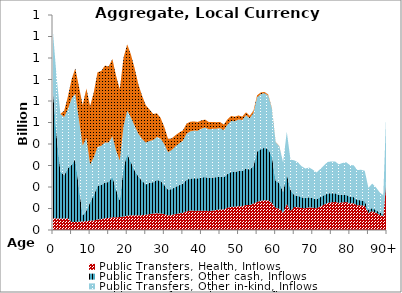
| Category | Public Transfers, Health, Inflows | Public Transfers, Other cash, Inflows | Public Transfers, Other in-kind, Inflows | Public Transfers, Education, Inflows |
|---|---|---|---|---|
| 0 | 54.789 | 587.096 | 276.624 | 0 |
|  | 54.008 | 380.12 | 272.701 | 0 |
| 2 | 53.123 | 218.868 | 268.159 | 0 |
| 3 | 53.631 | 201.026 | 270.72 | 29.086 |
| 4 | 54.276 | 232.747 | 273.899 | 58.863 |
| 5 | 37.599 | 265.832 | 307.521 | 89.568 |
| 6 | 37.187 | 292.331 | 304.111 | 118.118 |
| 7 | 38.76 | 156.553 | 316.979 | 153.92 |
| 8 | 39.681 | 27.833 | 324.344 | 189.04 |
| 9 | 41.269 | 49.896 | 337.295 | 229.403 |
| 10 | 43.597 | 85.213 | 176.062 | 270.572 |
| 11 | 44.472 | 118.352 | 175.472 | 303.498 |
| 12 | 48.915 | 156.402 | 180.71 | 347.448 |
| 13 | 51.191 | 158.736 | 181.421 | 348.331 |
| 14 | 54.673 | 166.328 | 186.463 | 357.532 |
| 15 | 55.994 | 167.238 | 184.292 | 352.915 |
| 16 | 59.045 | 188.915 | 188.003 | 359.574 |
| 17 | 58.83 | 130.07 | 181.619 | 346.948 |
| 18 | 60.4 | 77.024 | 185.632 | 330.999 |
| 19 | 63.025 | 226.471 | 192.848 | 319.671 |
| 20 | 66.03 | 287.7 | 201.171 | 308.57 |
| 21 | 68.37 | 247.43 | 207.416 | 292.829 |
| 22 | 68.592 | 208.459 | 207.225 | 267.601 |
| 23 | 67.934 | 181.501 | 198.26 | 230.102 |
| 24 | 69.314 | 159.16 | 195.544 | 200.999 |
| 25 | 71.306 | 140.739 | 194.576 | 173.79 |
| 26 | 73.596 | 145.83 | 194.364 | 147.016 |
| 27 | 76.732 | 145.528 | 196.234 | 121.177 |
| 28 | 77.951 | 155.156 | 199.544 | 110.054 |
| 29 | 76.903 | 151.579 | 197.048 | 95.861 |
| 30 | 73.943 | 134.869 | 189.64 | 80.097 |
| 31 | 67.765 | 120.031 | 173.955 | 62.474 |
| 32 | 70.797 | 119.549 | 181.904 | 53.99 |
| 33 | 74.019 | 126.425 | 188.037 | 52.333 |
| 34 | 77.454 | 130.869 | 194.555 | 50.529 |
| 35 | 79.893 | 136.83 | 198.444 | 47.827 |
| 36 | 86.907 | 147.287 | 213.472 | 47.434 |
| 37 | 90.394 | 148.835 | 219.586 | 44.638 |
| 38 | 89.938 | 151.115 | 221.25 | 42.623 |
| 39 | 89.13 | 150.882 | 222.084 | 40.418 |
| 40 | 89.877 | 154.099 | 226.868 | 38.869 |
| 41 | 89.946 | 156.604 | 230.052 | 36.956 |
| 42 | 87.601 | 153.465 | 227.066 | 34.048 |
| 43 | 90.273 | 154.093 | 226.363 | 32.165 |
| 44 | 93.029 | 152.225 | 225.899 | 30.323 |
| 45 | 95.775 | 152.795 | 225.437 | 28.487 |
| 46 | 95.796 | 149.721 | 218.771 | 25.922 |
| 47 | 103.267 | 156.839 | 229.007 | 25.329 |
| 48 | 107.844 | 162.134 | 236.91 | 23.656 |
| 49 | 108.616 | 160.932 | 236.404 | 21.086 |
| 50 | 110.483 | 165.16 | 238.29 | 18.737 |
| 51 | 110.958 | 163.107 | 237.183 | 16.166 |
| 52 | 116.594 | 169.667 | 247.052 | 14.275 |
| 53 | 115.94 | 165.328 | 238.241 | 12.151 |
| 54 | 123.352 | 174.023 | 245.962 | 10.861 |
| 55 | 130.494 | 233.974 | 252.64 | 9.408 |
| 56 | 136.184 | 239.808 | 256.134 | 7.748 |
| 57 | 138.878 | 243.767 | 253.881 | 5.886 |
| 58 | 137.979 | 238.515 | 248.364 | 4.589 |
| 59 | 125.397 | 216.131 | 222.33 | 3.069 |
| 60 | 102.691 | 126.086 | 179.4 | 1.644 |
| 61 | 99.036 | 119.79 | 170.533 | 0.779 |
| 62 | 80.891 | 96.046 | 137.334 | 0 |
| 63 | 121.103 | 138.133 | 197.631 | 0 |
| 64 | 89.32 | 97.697 | 140.296 | 0 |
| 65 | 106.84 | 55.486 | 161.719 | 0 |
| 66 | 106.285 | 53.104 | 155.211 | 0 |
| 67 | 102.375 | 49.739 | 144.388 | 0 |
| 68 | 101.233 | 46.948 | 137.686 | 0 |
| 69 | 105.288 | 46.934 | 138.382 | 0 |
| 70 | 103.892 | 44.678 | 132.2 | 0 |
| 71 | 101.023 | 41.857 | 124.67 | 0 |
| 72 | 109.005 | 43.588 | 130.665 | 0 |
| 73 | 117.708 | 43.954 | 138.786 | 0 |
| 74 | 125.924 | 44.106 | 146.321 | 0 |
| 75 | 128.818 | 42.41 | 147.753 | 0 |
| 76 | 130.522 | 40.529 | 147.975 | 0 |
| 77 | 126.427 | 37.274 | 141.839 | 0 |
| 78 | 128.779 | 35.6 | 147.376 | 0 |
| 79 | 130.027 | 33.793 | 151.381 | 0 |
| 80 | 124.484 | 30.514 | 147.115 | 0 |
| 81 | 124.012 | 28.767 | 148.502 | 0 |
| 82 | 114.746 | 25.287 | 139.023 | 0 |
| 83 | 114.744 | 23.373 | 141.953 | 0 |
| 84 | 112.556 | 21.275 | 141.712 | 0 |
| 85 | 79.79 | 14.089 | 101.974 | 0 |
| 86 | 87.713 | 14.553 | 113.557 | 0 |
| 87 | 80.676 | 12.605 | 105.629 | 0 |
| 88 | 70.916 | 10.347 | 94.672 | 0 |
| 89 | 64.605 | 8.846 | 87.702 | 0 |
| 90+ | 258.855 | 29.377 | 360.574 | 0 |